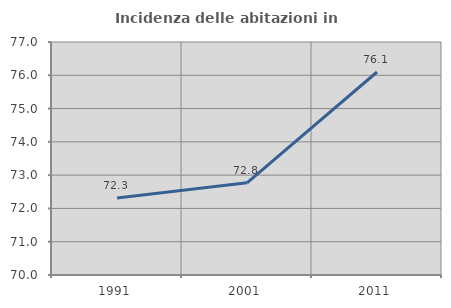
| Category | Incidenza delle abitazioni in proprietà  |
|---|---|
| 1991.0 | 72.31 |
| 2001.0 | 72.769 |
| 2011.0 | 76.099 |